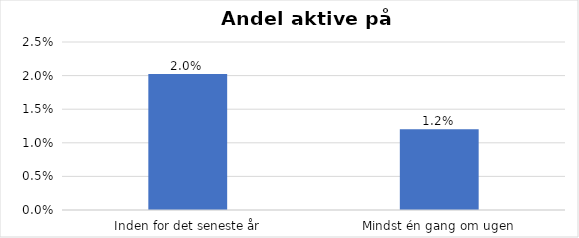
| Category | % |
|---|---|
| Inden for det seneste år | 0.02 |
| Mindst én gang om ugen | 0.012 |